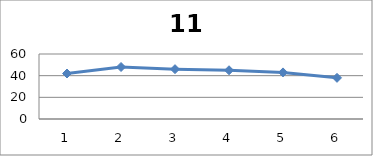
| Category | Series 0 |
|---|---|
| 0 | 42 |
| 1 | 48 |
| 2 | 46 |
| 3 | 45 |
| 4 | 43 |
| 5 | 38 |